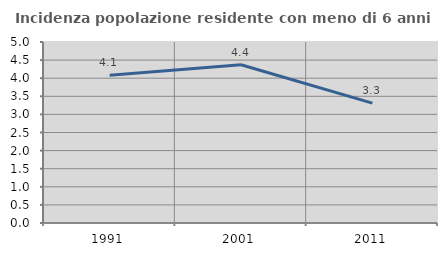
| Category | Incidenza popolazione residente con meno di 6 anni |
|---|---|
| 1991.0 | 4.084 |
| 2001.0 | 4.373 |
| 2011.0 | 3.312 |